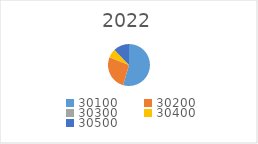
| Category | Series 0 |
|---|---|
| 30100.0 | 1413050.58 |
| 30200.0 | 685978.89 |
| 30300.0 | 2190 |
| 30400.0 | 174836.39 |
| 30500.0 | 315564.34 |